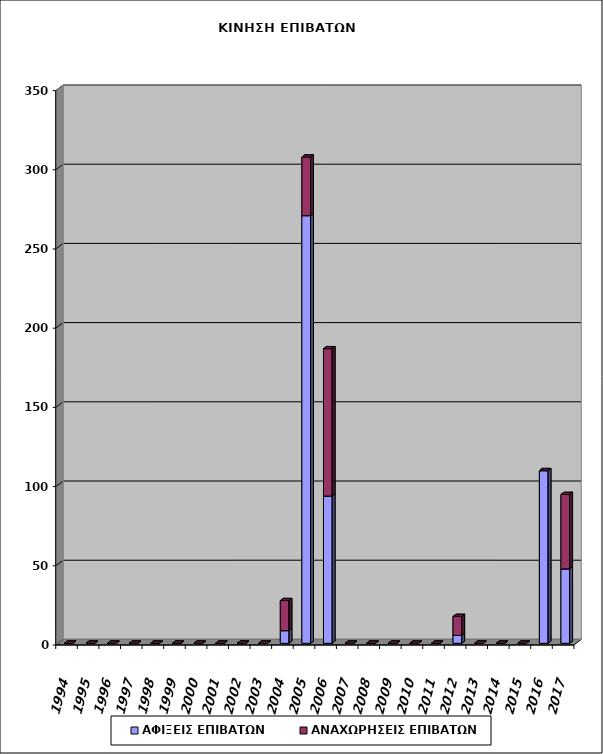
| Category | ΑΦΙΞΕΙΣ ΕΠΙΒΑΤΩΝ | ΑΝΑΧΩΡΗΣΕΙΣ ΕΠΙΒΑΤΩΝ |
|---|---|---|
| 1994.0 | 0 | 0 |
| 1995.0 | 0 | 0 |
| 1996.0 | 0 | 0 |
| 1997.0 | 0 | 0 |
| 1998.0 | 0 | 0 |
| 1999.0 | 0 | 0 |
| 2000.0 | 0 | 0 |
| 2001.0 | 0 | 0 |
| 2002.0 | 0 | 0 |
| 2003.0 | 0 | 0 |
| 2004.0 | 8 | 19 |
| 2005.0 | 270 | 37 |
| 2006.0 | 93 | 93 |
| 2007.0 | 0 | 0 |
| 2008.0 | 0 | 0 |
| 2009.0 | 0 | 0 |
| 2010.0 | 0 | 0 |
| 2011.0 | 0 | 0 |
| 2012.0 | 5 | 12 |
| 2013.0 | 0 | 0 |
| 2014.0 | 0 | 0 |
| 2015.0 | 0 | 0 |
| 2016.0 | 109 | 0 |
| 2017.0 | 47 | 47 |